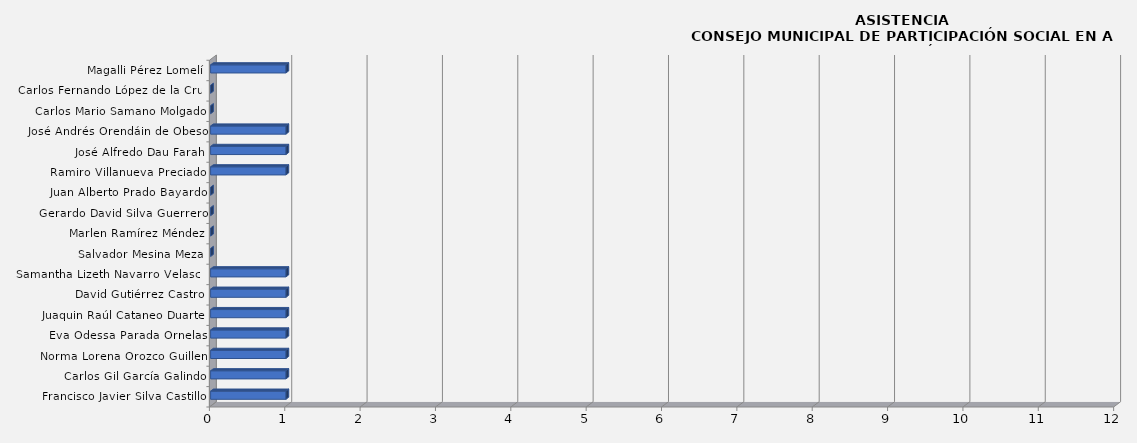
| Category | Series 0 |
|---|---|
| Francisco Javier Silva Castillo | 1 |
| Carlos Gil García Galindo | 1 |
| Norma Lorena Orozco Guillen | 1 |
| Eva Odessa Parada Ornelas | 1 |
| Juaquin Raúl Cataneo Duarte | 1 |
| David Gutiérrez Castro | 1 |
| Samantha Lizeth Navarro Velasco | 1 |
| Salvador Mesina Meza | 0 |
| Marlen Ramírez Méndez | 0 |
| Gerardo David Silva Guerrero | 0 |
| Juan Alberto Prado Bayardo | 0 |
| Ramiro Villanueva Preciado | 1 |
| José Alfredo Dau Farah | 1 |
| José Andrés Orendáin de Obeso | 1 |
| Carlos Mario Samano Molgado | 0 |
| Carlos Fernando López de la Cruz | 0 |
| Magalli Pérez Lomelí | 1 |